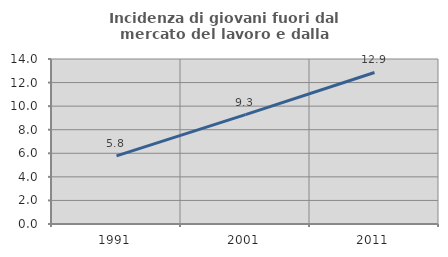
| Category | Incidenza di giovani fuori dal mercato del lavoro e dalla formazione  |
|---|---|
| 1991.0 | 5.785 |
| 2001.0 | 9.278 |
| 2011.0 | 12.857 |